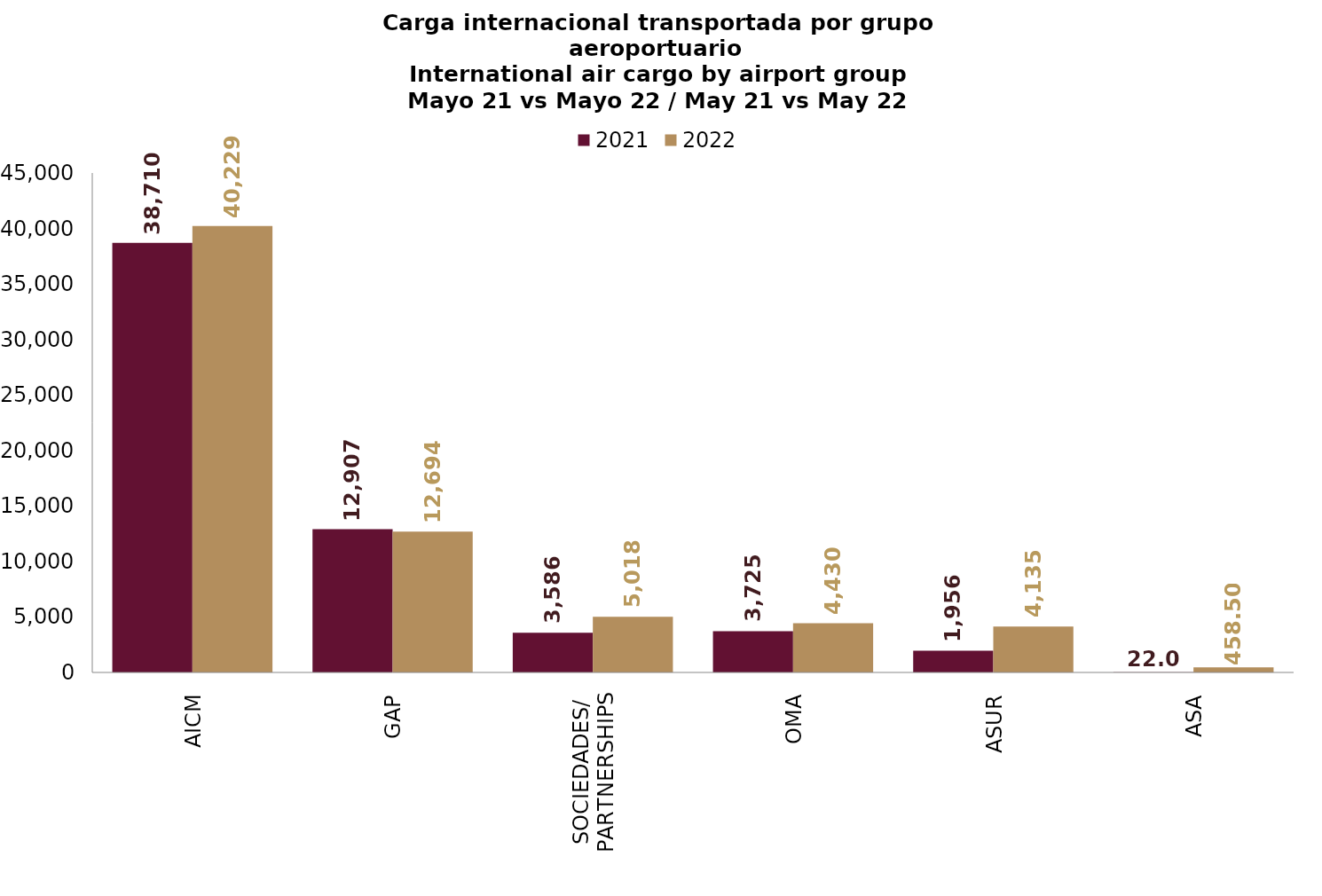
| Category | 2021 | 2022 |
|---|---|---|
| AICM | 38709.98 | 40229.262 |
| GAP | 12907.116 | 12694.489 |
| SOCIEDADES/
PARTNERSHIPS | 3585.873 | 5017.502 |
| OMA | 3725.046 | 4430.19 |
| ASUR | 1955.988 | 4134.99 |
| ASA | 21.95 | 458.5 |